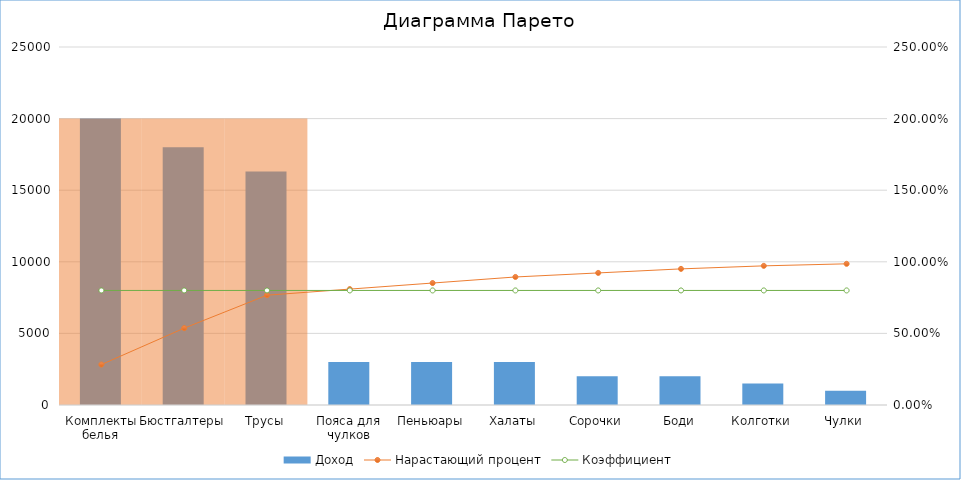
| Category | Доход |
|---|---|
| Комплекты белья | 20000 |
| Бюстгалтеры | 18000 |
| Трусы | 16300 |
| Пояса для чулков | 3000 |
| Пеньюары | 3000 |
| Халаты | 3000 |
| Сорочки | 2000 |
| Боди | 2000 |
| Колготки | 1500 |
| Чулки | 1000 |